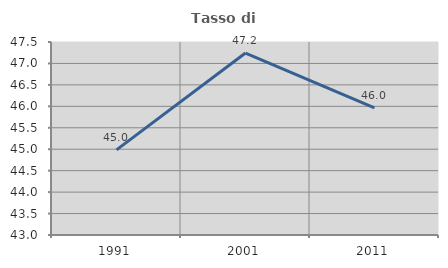
| Category | Tasso di occupazione   |
|---|---|
| 1991.0 | 44.984 |
| 2001.0 | 47.243 |
| 2011.0 | 45.963 |